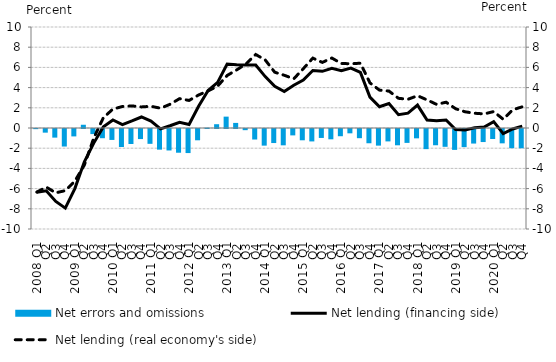
| Category | Net errors and omissions |
|---|---|
| 2008 Q1 | -0.014 |
| Q2 | -0.362 |
| Q3 | -0.854 |
| Q4 | -1.737 |
| 2009 Q1 | -0.733 |
| Q2 | 0.322 |
| Q3 | -0.503 |
| Q4 | -0.912 |
| 2010 Q1 | -1.082 |
| Q2 | -1.785 |
| Q3 | -1.488 |
| Q4 | -0.997 |
| 2011 Q1 | -1.468 |
| Q2 | -2.043 |
| Q3 | -2.126 |
| Q4 | -2.349 |
| 2012 Q1 | -2.383 |
| Q2 | -1.118 |
| Q3 | 0.036 |
| Q4 | 0.376 |
| 2013 Q1 | 1.125 |
| Q2 | 0.504 |
| Q3 | -0.116 |
| Q4 | -1.041 |
| 2014 Q1 | -1.648 |
| Q2 | -1.39 |
| Q3 | -1.617 |
| Q4 | -0.632 |
| 2015 Q1 | -1.118 |
| Q2 | -1.23 |
| Q3 | -0.886 |
| Q4 | -1.02 |
| 2016 Q1 | -0.716 |
| Q2 | -0.429 |
| Q3 | -0.91 |
| Q4 | -1.412 |
| 2017 Q1 | -1.647 |
| Q2 | -1.228 |
| Q3 | -1.613 |
| Q4 | -1.376 |
| 2018 Q1 | -0.924 |
| Q2 | -1.994 |
| Q3 | -1.61 |
| Q4 | -1.764 |
| 2019 Q1 | -2.068 |
| Q2 | -1.796 |
| Q3 | -1.441 |
| Q4 | -1.292 |
| 2020 Q1 | -0.992 |
| Q2 | -1.419 |
| Q3 | -1.901 |
| Q4 | -1.909 |